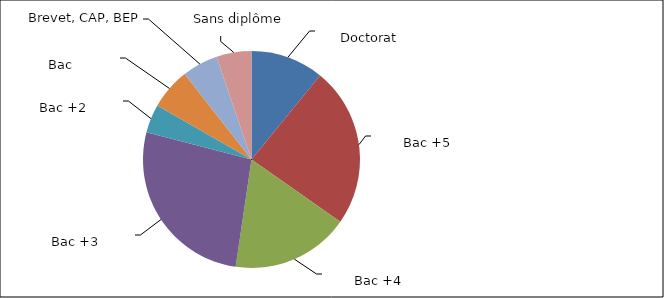
| Category | Series 0 |
|---|---|
| 0 | 0.109 |
| 1 | 0.238 |
| 2 | 0.176 |
| 3 | 0.267 |
| 4 | 0.042 |
| 5 | 0.062 |
| 6 | 0.053 |
| 7 | 0.052 |